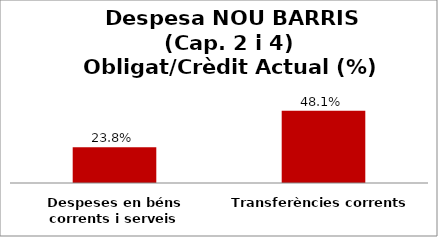
| Category | Series 0 |
|---|---|
| Despeses en béns corrents i serveis | 0.238 |
| Transferències corrents | 0.481 |